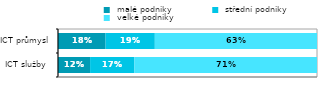
| Category |  malé podniky |  střední podniky |  velké podniky |
|---|---|---|---|
| ICT služby  | 0.124 | 0.171 | 0.705 |
| ICT průmysl | 0.184 | 0.19 | 0.626 |